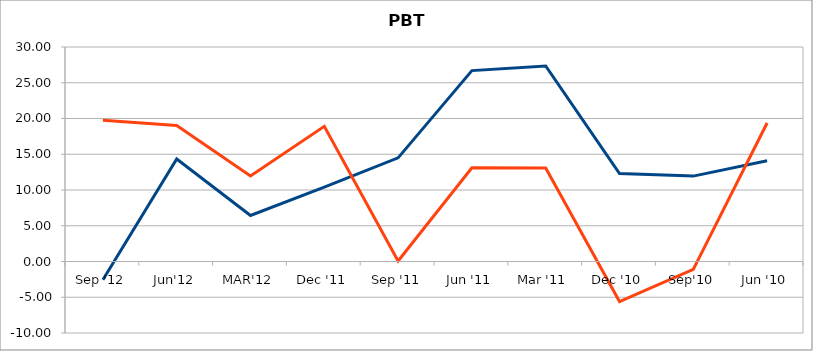
| Category | a | b |
|---|---|---|
| Sep '12 | -2.553 | 19.763 |
| Jun'12 | 14.333 | 19.025 |
| MAR'12 | 6.437 | 11.95 |
| Dec '11 | 10.407 | 18.903 |
| Sep '11 | 14.496 | 0.064 |
| Jun '11 | 26.698 | 13.113 |
| Mar '11 | 27.345 | 13.089 |
| Dec '10 | 12.293 | -5.604 |
| Sep'10 | 11.942 | -1.094 |
| Jun '10 | 14.09 | 19.378 |